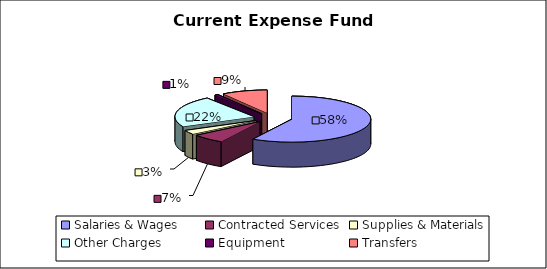
| Category | Series 0 |
|---|---|
| Salaries & Wages | 6795798570.98 |
| Contracted Services | 778408615.24 |
| Supplies & Materials | 345546956.49 |
| Other Charges | 2574677144.09 |
| Equipment | 85480024.26 |
| Transfers | 1092614737.89 |